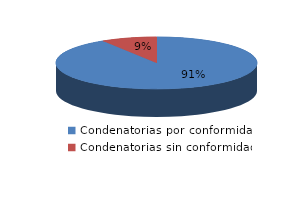
| Category | Series 0 |
|---|---|
| 0 | 549 |
| 1 | 54 |